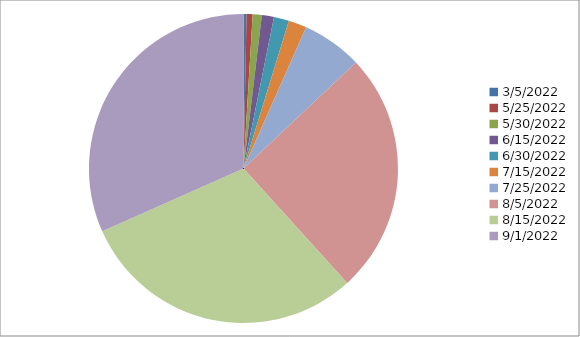
| Category | Series 0 |
|---|---|
| 44625.0 | 1 |
| 44706.0 | 2 |
| 44711.0 | 3 |
| 44727.0 | 4 |
| 44742.0 | 5 |
| 44757.0 | 6 |
| 44767.0 | 20 |
| 44778.0 | 80 |
| 44788.0 | 95 |
| 44805.0 | 100 |